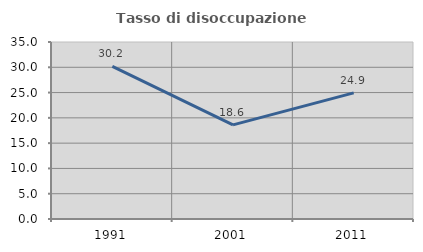
| Category | Tasso di disoccupazione giovanile  |
|---|---|
| 1991.0 | 30.199 |
| 2001.0 | 18.615 |
| 2011.0 | 24.943 |